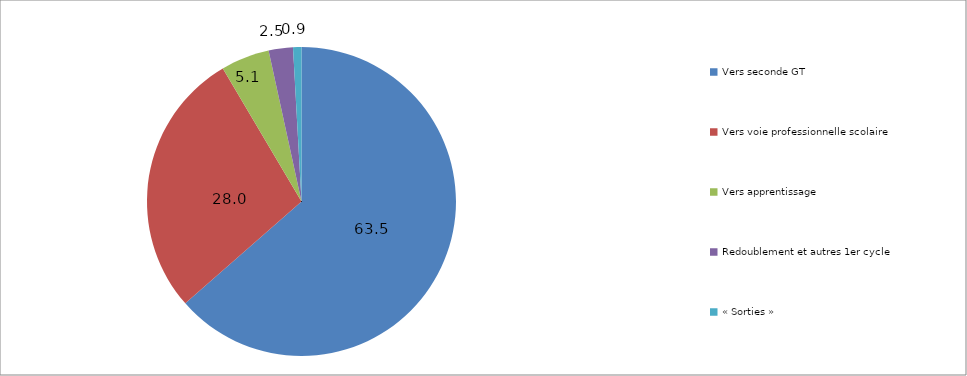
| Category | Vers seconde GT Vers voie professionnelle scolaire Vers apprentissage Redoublement et autres 1er cycle « Sorties » |
|---|---|
| Vers seconde GT | 63.542 |
| Vers voie professionnelle scolaire | 27.955 |
| Vers apprentissage | 5.084 |
| Redoublement et autres 1er cycle | 2.542 |
| « Sorties » | 0.876 |